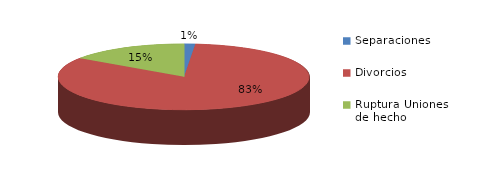
| Category | Series 0 |
|---|---|
| Separaciones | 5 |
| Divorcios | 292 |
| Ruptura Uniones de hecho | 54 |